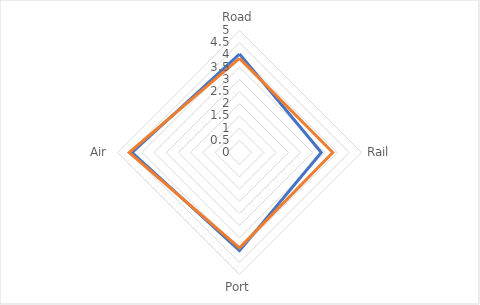
| Category | Global Average | Indonesia |
|---|---|---|
| Road | 4.037 | 3.859 |
| Rail | 3.351 | 3.823 |
| Port | 4.022 | 3.907 |
| Air | 4.401 | 4.52 |